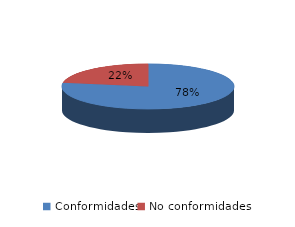
| Category | Series 0 |
|---|---|
| Conformidades | 743 |
| No conformidades | 215 |